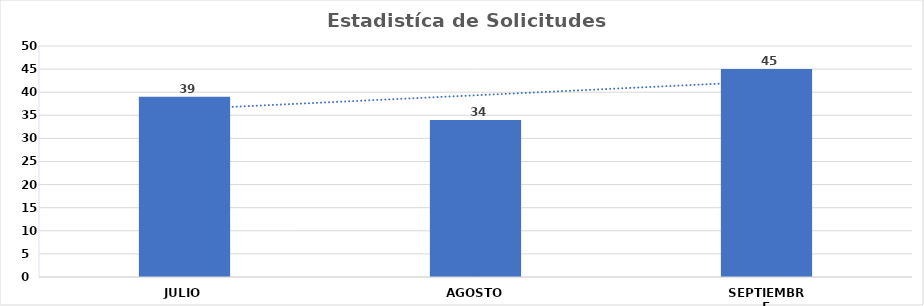
| Category | Series 0 |
|---|---|
| JULIO | 39 |
| AGOSTO | 34 |
| SEPTIEMBRE | 45 |